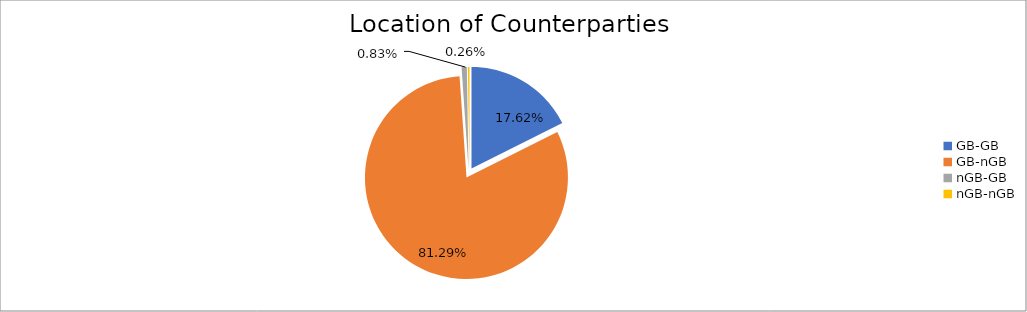
| Category | Series 0 |
|---|---|
| GB-GB | 1513351.433 |
| GB-nGB | 6981028.043 |
| nGB-GB | 71181.026 |
| nGB-nGB | 22475.699 |